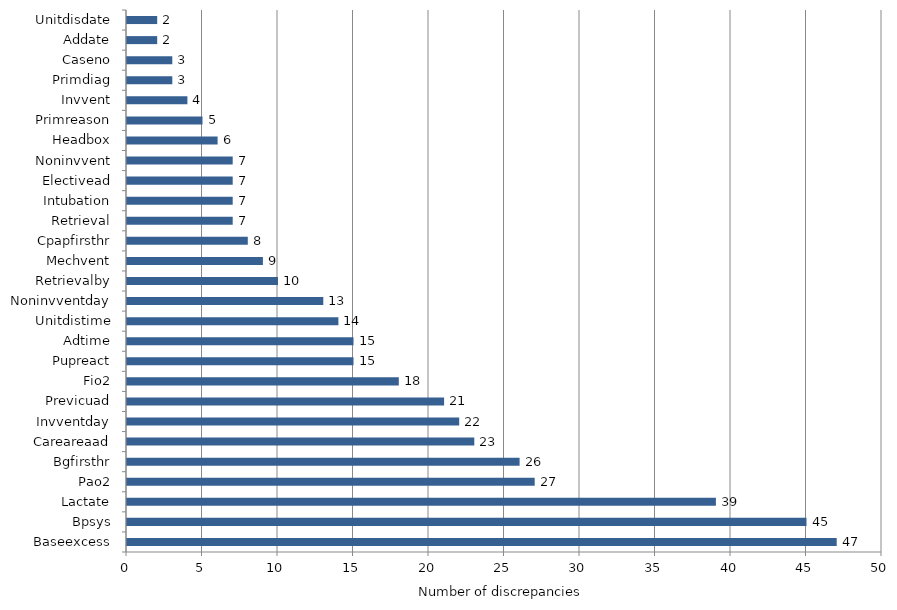
| Category | Number of discrepancies |
|---|---|
| Baseexcess | 47 |
| Bpsys | 45 |
| Lactate | 39 |
| Pao2 | 27 |
| Bgfirsthr | 26 |
| Careareaad | 23 |
| Invventday | 22 |
| Previcuad | 21 |
| Fio2 | 18 |
| Pupreact | 15 |
| Adtime | 15 |
| Unitdistime | 14 |
| Noninvventday | 13 |
| Retrievalby | 10 |
| Mechvent | 9 |
| Cpapfirsthr | 8 |
| Retrieval | 7 |
| Intubation | 7 |
| Electivead | 7 |
| Noninvvent | 7 |
| Headbox | 6 |
| Primreason | 5 |
| Invvent | 4 |
| Primdiag | 3 |
| Caseno | 3 |
| Addate | 2 |
| Unitdisdate | 2 |